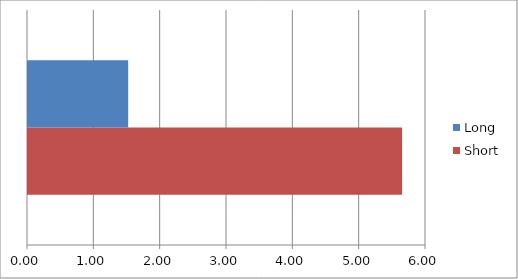
| Category | Short | Long |
|---|---|---|
| 0 | 5.64 | 1.51 |